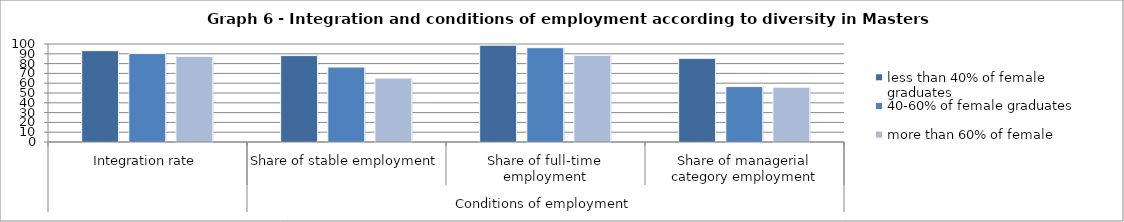
| Category | less than 40% of female graduates  | 40-60% of female graduates | more than 60% of female graduates |
|---|---|---|---|
| 0 | 93.23 | 90.24 | 87.25 |
| 1 | 88.16 | 76.49 | 65.2 |
| 2 | 98.78 | 96.23 | 88.46 |
| 3 | 85.37 | 56.55 | 55.87 |